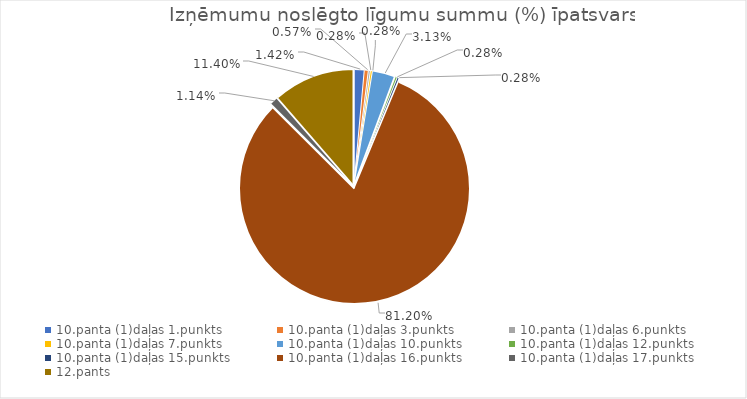
| Category | Īpatsvars (%) |
|---|---|
| 10.panta (1)daļas 1.punkts | 0.014 |
| 10.panta (1)daļas 3.punkts | 0.006 |
| 10.panta (1)daļas 6.punkts | 0.003 |
| 10.panta (1)daļas 7.punkts | 0.003 |
| 10.panta (1)daļas 10.punkts | 0.031 |
| 10.panta (1)daļas 12.punkts | 0.003 |
| 10.panta (1)daļas 15.punkts | 0.003 |
| 10.panta (1)daļas 16.punkts | 0.812 |
| 10.panta (1)daļas 17.punkts | 0.011 |
| 12.pants | 0.114 |